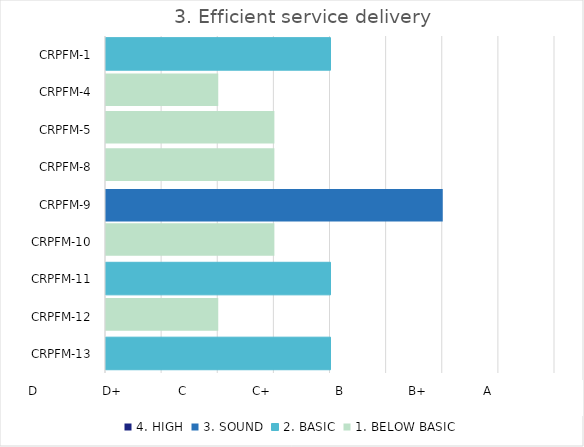
| Category | 4. HIGH | 3. SOUND | 2. BASIC | 1. BELOW BASIC |
|---|---|---|---|---|
| CRPFM-13 | 0 | 0 | 2 | 0 |
| CRPFM-12 | 0 | 0 | 0 | 1 |
| CRPFM-11 | 0 | 0 | 2 | 0 |
| CRPFM-10 | 0 | 0 | 0 | 1.5 |
| CRPFM-9 | 0 | 3 | 0 | 0 |
| CRPFM-8 | 0 | 0 | 0 | 1.5 |
| CRPFM-5 | 0 | 0 | 0 | 1.5 |
| CRPFM-4 | 0 | 0 | 0 | 1 |
| CRPFM-1 | 0 | 0 | 2 | 0 |